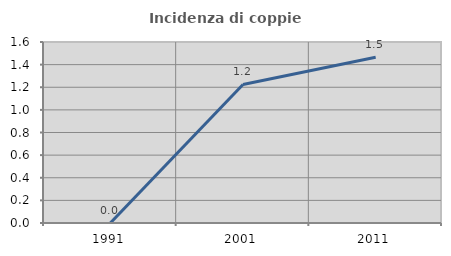
| Category | Incidenza di coppie miste |
|---|---|
| 1991.0 | 0 |
| 2001.0 | 1.224 |
| 2011.0 | 1.465 |